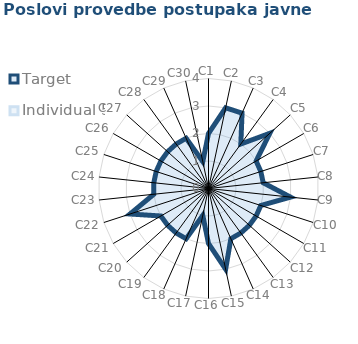
| Category | Target | Individual 5 |
|---|---|---|
| C1 | 2 | 0 |
| C2 | 3 | 0 |
| C3 | 3 | 0 |
| C4 | 2 | 0 |
| C5 | 3 | 0 |
| C6 | 2 | 0 |
| C7 | 2 | 0 |
| C8 | 2 | 0 |
| C9 | 3 | 0 |
| C10 | 2 | 0 |
| C11 | 2 | 0 |
| C12 | 2 | 0 |
| C13 | 2 | 0 |
| C14 | 2 | 0 |
| C15 | 3 | 0 |
| C16 | 2 | 0 |
| C17 | 1 | 0 |
| C18 | 2 | 0 |
| C19 | 2 | 0 |
| C20 | 2 | 0 |
| C21 | 2 | 0 |
| C22 | 3 | 0 |
| C23 | 2 | 0 |
| C24 | 2 | 0 |
| C25 | 2 | 0 |
| C26 | 2 | 0 |
| C27 | 2 | 0 |
| C28 | 2 | 0 |
| C29 | 2 | 0 |
| C30 | 1 | 0 |